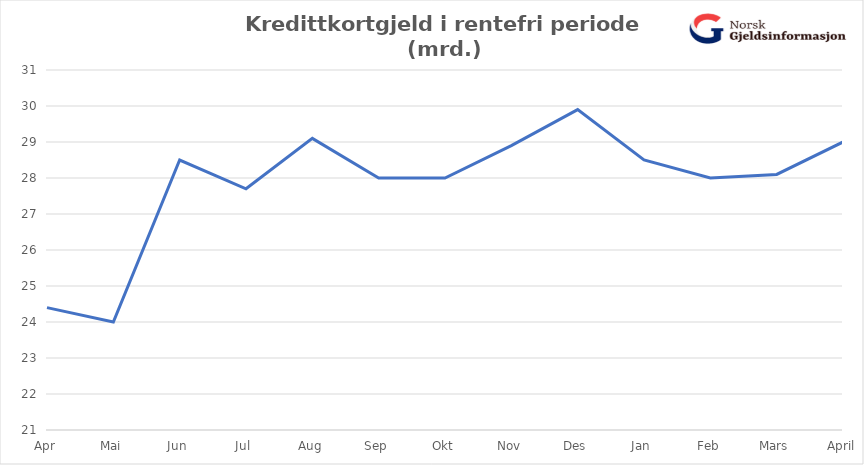
| Category | Ikke-rentebærende rammekreditt | Rentebærende rammekreditt |
|---|---|---|
| Apr | 24.4 |  |
| Mai | 24 |  |
| Jun | 28.5 |  |
| Jul | 27.7 |  |
| Aug | 29.1 |  |
| Sep | 28 |  |
| Okt | 28 |  |
| Nov | 28.9 |  |
| Des | 29.9 |  |
| Jan | 28.5 |  |
| Feb | 28 |  |
| Mars | 28.1 |  |
| April | 29 |  |